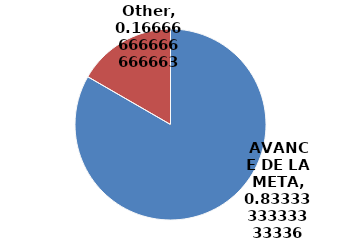
| Category | Series 0 |
|---|---|
| AVANCE DE LA META | 0.833 |